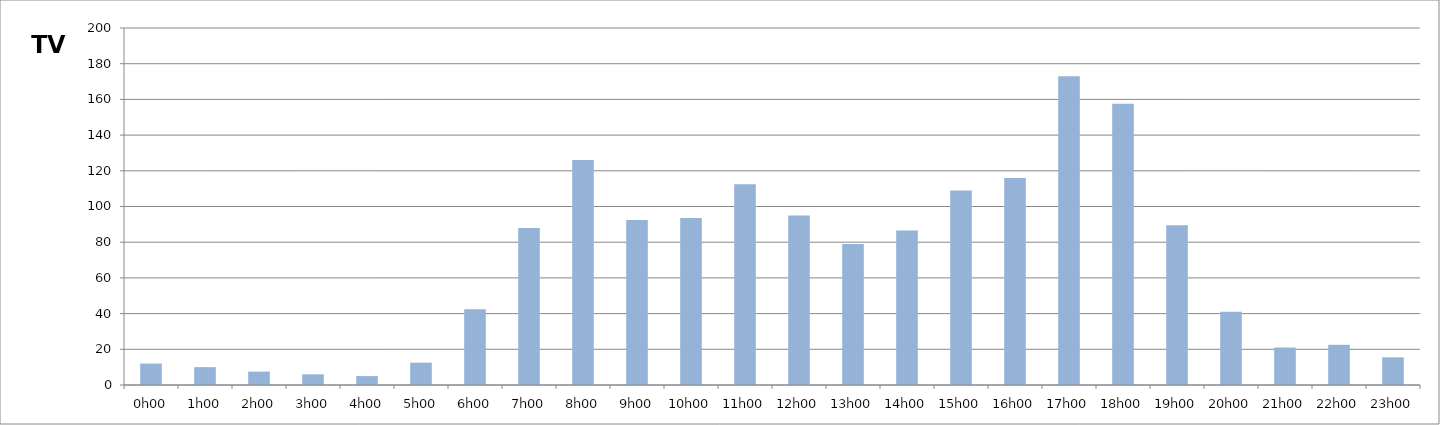
| Category | TV |
|---|---|
| 0.0 | 12 |
| 0.041666666666666664 | 10 |
| 0.08333333333333333 | 7.5 |
| 0.125 | 6 |
| 0.16666666666666666 | 5 |
| 0.20833333333333334 | 12.5 |
| 0.25 | 42.5 |
| 0.2916666666666667 | 88 |
| 0.3333333333333333 | 126 |
| 0.375 | 92.5 |
| 0.4166666666666667 | 93.5 |
| 0.4583333333333333 | 112.5 |
| 0.5 | 95 |
| 0.5416666666666666 | 79 |
| 0.5833333333333334 | 86.5 |
| 0.625 | 109 |
| 0.6666666666666666 | 116 |
| 0.7083333333333334 | 173 |
| 0.75 | 157.5 |
| 0.7916666666666666 | 89.5 |
| 0.8333333333333334 | 41 |
| 0.875 | 21 |
| 0.9166666666666666 | 22.5 |
| 0.9583333333333334 | 15.5 |